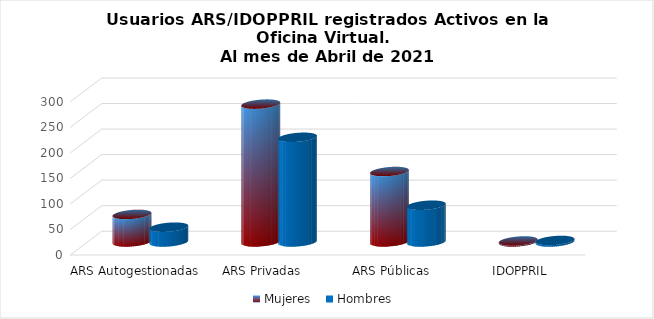
| Category | Mujeres | Hombres |
|---|---|---|
| ARS Autogestionadas | 54 | 29 |
| ARS Privadas | 270 | 205 |
| ARS Públicas | 138 | 72 |
| IDOPPRIL | 2 | 3 |